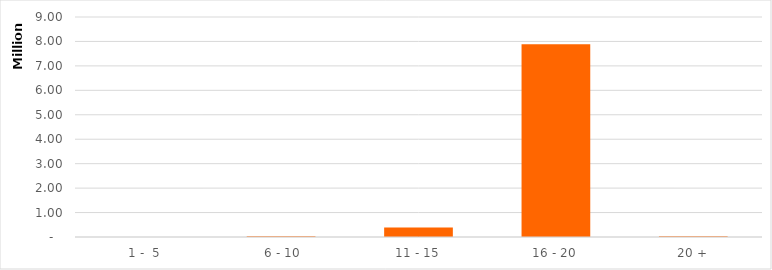
| Category | Series 0 |
|---|---|
|  1 -  5 | 0 |
|  6 - 10 | 25948.252 |
| 11 - 15 | 386570.471 |
| 16 - 20 | 7887959.452 |
| 20 + | 28438.365 |